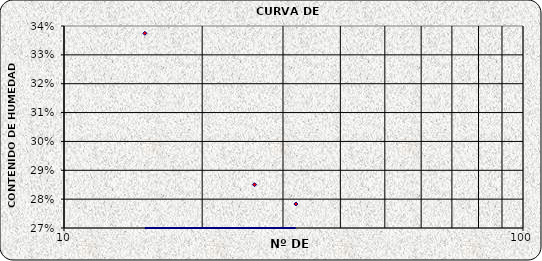
| Category | Series 0 |
|---|---|
| 32.0 | 0.278 |
| 26.0 | 0.285 |
| 15.0 | 0.337 |